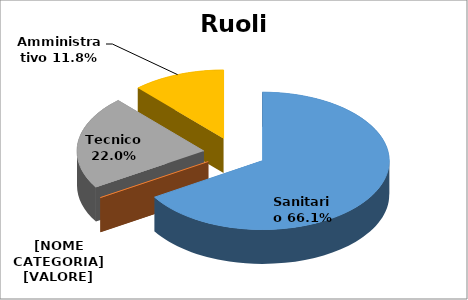
| Category | Series 0 |
|---|---|
| Sanitario | 0.661 |
| Professionale | 0.001 |
| Tecnico | 0.22 |
| Amministrativo | 0.118 |